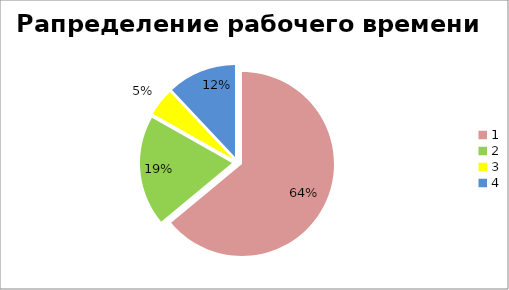
| Category | Series 0 |
|---|---|
| 0 | 0.278 |
| 1 | 0.083 |
| 2 | 0.021 |
| 3 | 0.052 |